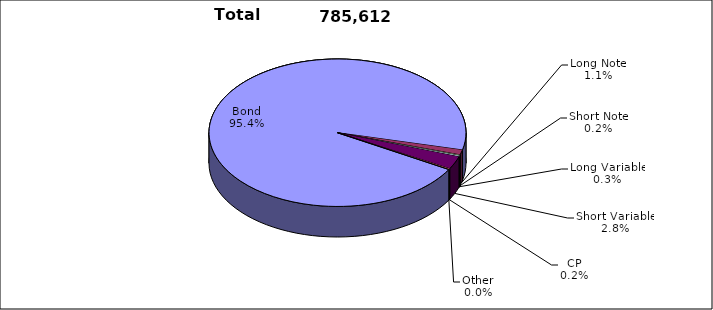
| Category | Trades |
|---|---|
| Bond | 749639 |
| Long Note | 8665 |
| Short Note | 1397 |
| Long Variable | 1979 |
| Short Variable | 22242 |
| CP | 1434 |
| Other | 256 |